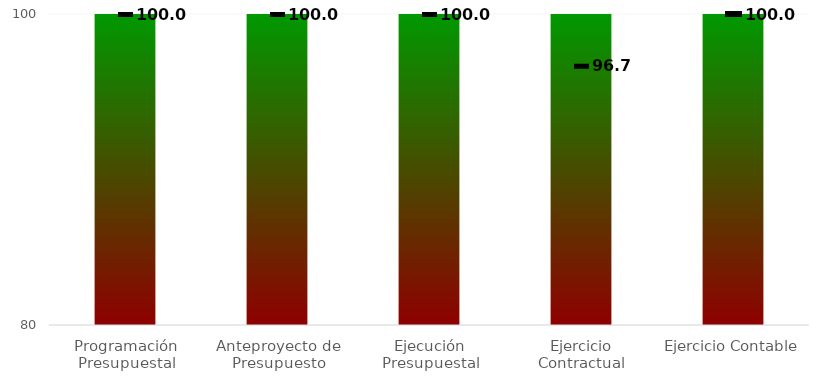
| Category | Niveles |
|---|---|
| Programación Presupuestal | 100 |
| Anteproyecto de Presupuesto | 100 |
| Ejecución Presupuestal | 100 |
| Ejercicio Contractual | 100 |
| Ejercicio Contable | 100 |